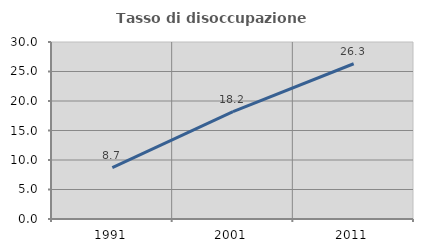
| Category | Tasso di disoccupazione giovanile  |
|---|---|
| 1991.0 | 8.696 |
| 2001.0 | 18.182 |
| 2011.0 | 26.316 |